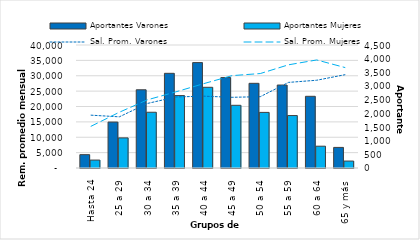
| Category | Aportantes Varones | Aportantes Mujeres |
|---|---|---|
| Hasta 24 | 488 | 290 |
| 25 a 29 | 1681 | 1101 |
| 30 a 34 | 2862 | 2040 |
| 35 a 39 | 3464 | 2650 |
| 40 a 44 | 3856 | 2952 |
| 45 a 49 | 3308 | 2294 |
| 50 a 54 | 3098 | 2034 |
| 55 a 59 | 3035 | 1919 |
| 60 a 64 | 2623 | 798 |
| 65 y más | 753 | 254 |